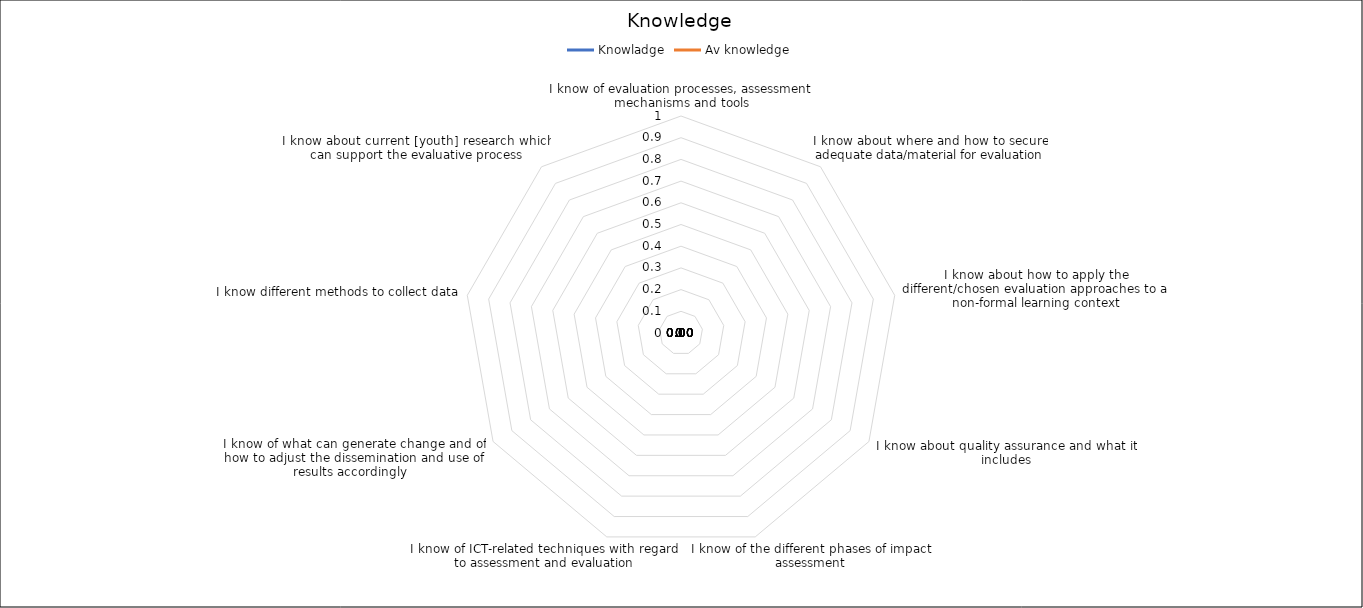
| Category | Knowladge | Av knowledge |
|---|---|---|
| I know of evaluation processes, assessment mechanisms and tools | 0 | 0 |
| I know about where and how to secure adequate data/material for evaluation | 0 | 0 |
| I know about how to apply the different/chosen evaluation approaches to a non-formal learning context | 0 | 0 |
| I know about quality assurance and what it includes | 0 | 0 |
| I know of the different phases of impact assessment | 0 | 0 |
| I know of ICT-related techniques with regard to assessment and evaluation | 0 | 0 |
| I know of what can generate change and of how to adjust the dissemination and use of results accordingly   | 0 | 0 |
| I know different methods to collect data | 0 | 0 |
| I know about current [youth] research which can support the evaluative process | 0 | 0 |